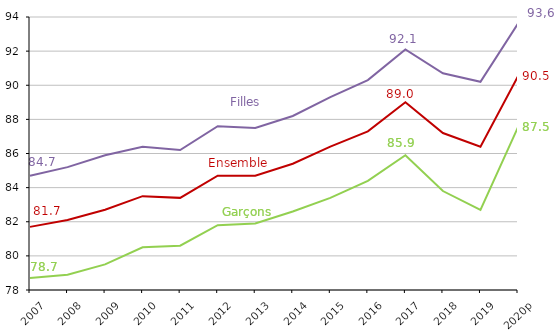
| Category | Garçons | Filles | Ensemble |
|---|---|---|---|
| 2007 | 78.7 | 84.7 | 81.7 |
| 2008 | 78.9 | 85.2 | 82.1 |
| 2009 | 79.5 | 85.9 | 82.7 |
| 2010 | 80.5 | 86.4 | 83.5 |
| 2011 | 80.6 | 86.2 | 83.4 |
| 2012 | 81.8 | 87.6 | 84.7 |
| 2013 | 81.9 | 87.5 | 84.7 |
| 2014 | 82.6 | 88.2 | 85.4 |
| 2015 | 83.4 | 89.3 | 86.4 |
| 2016 | 84.4 | 90.3 | 87.3 |
| 2017 | 85.9 | 92.1 | 89 |
| 2018 | 83.8 | 90.7 | 87.2 |
| 2019 | 82.7 | 90.2 | 86.4 |
| 2020p | 87.546 | 93.612 | 90.526 |